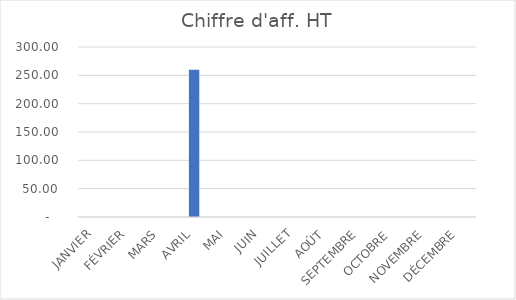
| Category | Chiffre d'aff. HT |
|---|---|
| JANVIER | 0 |
| FÉVRIER | 0 |
| MARS | 0 |
| AVRIL | 260 |
| MAI | 0 |
| JUIN | 0 |
| JUILLET | 0 |
| AOÛT | 0 |
| SEPTEMBRE | 0 |
| OCTOBRE | 0 |
| NOVEMBRE | 0 |
| DÉCEMBRE | 0 |